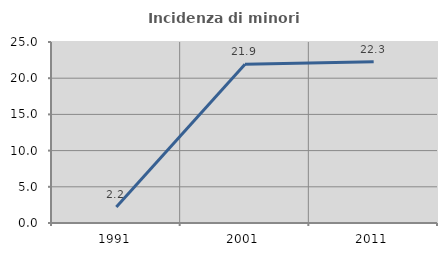
| Category | Incidenza di minori stranieri |
|---|---|
| 1991.0 | 2.222 |
| 2001.0 | 21.941 |
| 2011.0 | 22.257 |